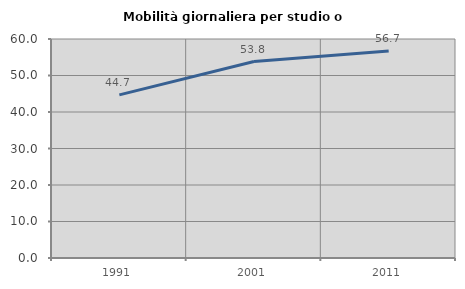
| Category | Mobilità giornaliera per studio o lavoro |
|---|---|
| 1991.0 | 44.694 |
| 2001.0 | 53.83 |
| 2011.0 | 56.741 |